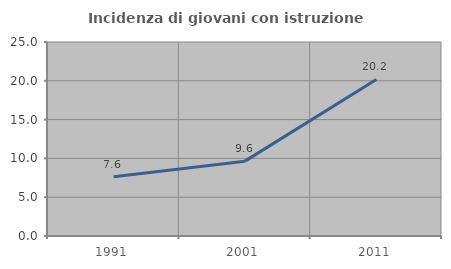
| Category | Incidenza di giovani con istruzione universitaria |
|---|---|
| 1991.0 | 7.631 |
| 2001.0 | 9.646 |
| 2011.0 | 20.177 |